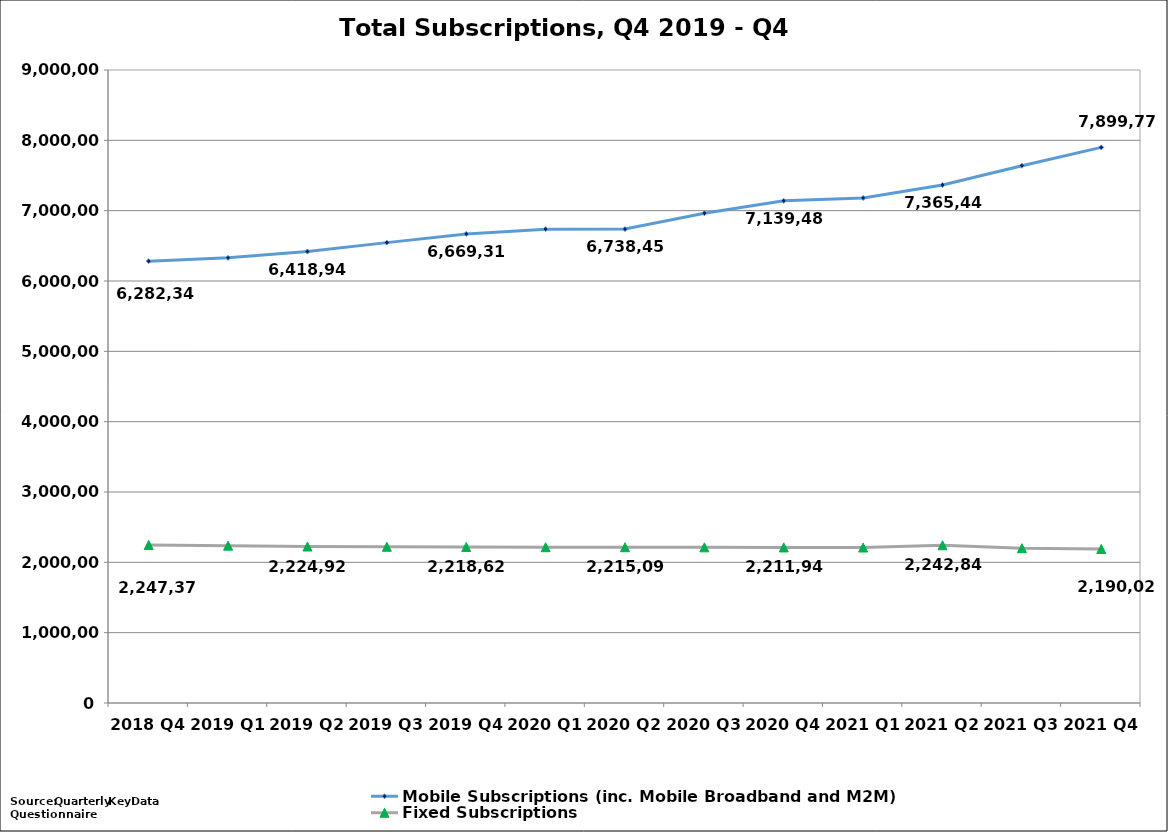
| Category | Mobile Subscriptions (inc. Mobile Broadband and M2M) | Fixed Subscriptions |
|---|---|---|
| 2018 Q4 | 6282346 | 2247375 |
| 2019 Q1 | 6329068 | 2237202.755 |
| 2019 Q2 | 6418948 | 2224921 |
| 2019 Q3 | 6545636 | 2221035 |
| 2019 Q4 | 6669317 | 2218622 |
| 2020 Q1 | 6737414 | 2215552 |
| 2020 Q2 | 6738457 | 2215092.885 |
| 2020 Q3 | 6964436 | 2213318.885 |
| 2020 Q4 | 7139486 | 2211940 |
| 2021 Q1 | 7180831 | 2210830 |
| 2021 Q2 | 7365441 | 2242845.42 |
| 2021 Q3 | 7638611 | 2200748.57 |
| 2021 Q4  | 7899776 | 2190027.57 |